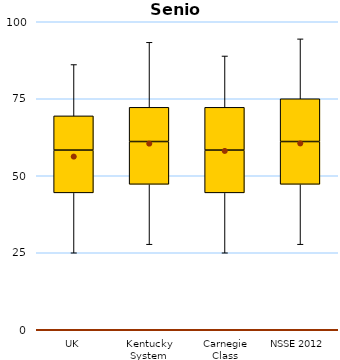
| Category | 25th | 50th | 75th |
|---|---|---|---|
| UK | 44.444 | 13.889 | 11.111 |
| Kentucky System | 47.222 | 13.889 | 11.111 |
| Carnegie Class | 44.444 | 13.889 | 13.889 |
| NSSE 2012 | 47.222 | 13.889 | 13.889 |